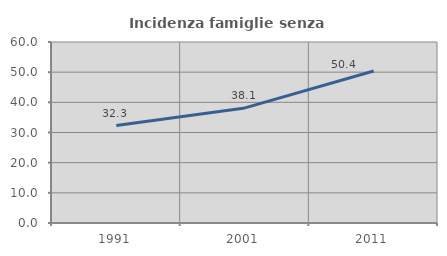
| Category | Incidenza famiglie senza nuclei |
|---|---|
| 1991.0 | 32.32 |
| 2001.0 | 38.146 |
| 2011.0 | 50.37 |